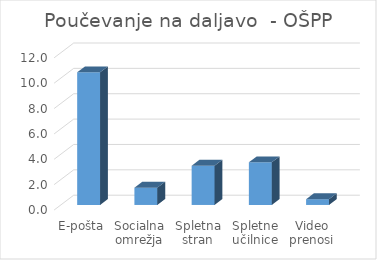
| Category | Series 0 |
|---|---|
| E-pošta | 10.455 |
| Socialna omrežja | 1.364 |
| Spletna stran | 3.091 |
| Spletne učilnice | 3.364 |
| Video prenosi | 0.455 |